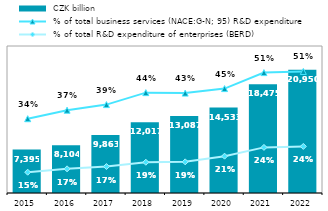
| Category |  CZK billion |
|---|---|
| 2015.0 | 7394.736 |
| 2016.0 | 8103.91 |
| 2017.0 | 9863.017 |
| 2018.0 | 12016.964 |
| 2019.0 | 13086.503 |
| 2020.0 | 14532.76 |
| 2021.0 | 18475.41 |
| 2022.0 | 20950.168 |